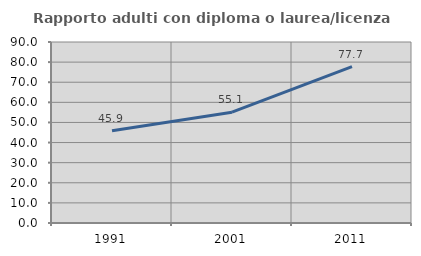
| Category | Rapporto adulti con diploma o laurea/licenza media  |
|---|---|
| 1991.0 | 45.85 |
| 2001.0 | 55.09 |
| 2011.0 | 77.748 |